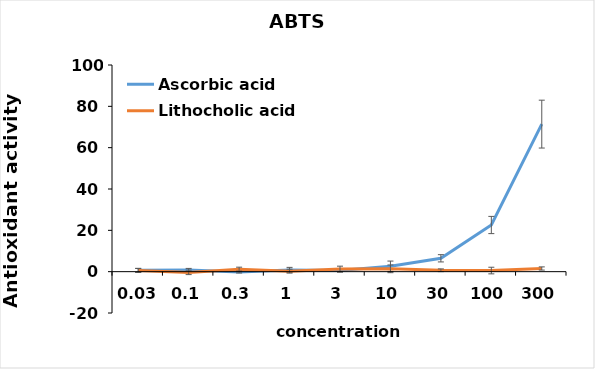
| Category | Ascorbic acid | Lithocholic acid |
|---|---|---|
| 0.03 | 0.649 | 0.598 |
| 0.1 | 0.777 | -0.345 |
| 0.3 | -0.172 | 1.227 |
| 1.0 | 0.855 | 0.244 |
| 3.0 | 0.562 | 1.284 |
| 10.0 | 2.627 | 1.376 |
| 30.0 | 6.469 | 0.677 |
| 100.0 | 22.576 | 0.544 |
| 300.0 | 71.397 | 1.541 |